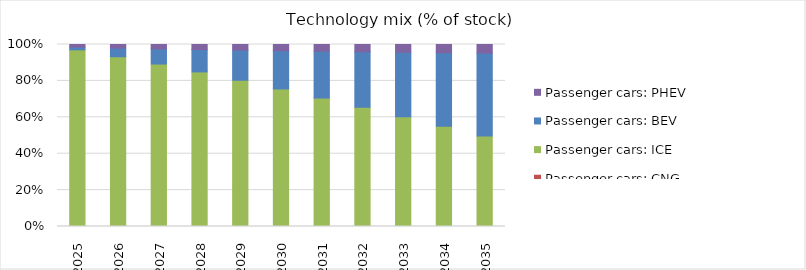
| Category | Passenger cars: CNG | Passenger cars: ICE | Passenger cars: BEV | Passenger cars: PHEV |
|---|---|---|---|---|
| 2025.0 | 0 | 0.97 | 0.015 | 0.014 |
| 2026.0 | 0 | 0.932 | 0.047 | 0.02 |
| 2027.0 | 0 | 0.892 | 0.083 | 0.024 |
| 2028.0 | 0 | 0.849 | 0.123 | 0.028 |
| 2029.0 | 0 | 0.803 | 0.165 | 0.031 |
| 2030.0 | 0 | 0.755 | 0.21 | 0.034 |
| 2031.0 | 0 | 0.706 | 0.257 | 0.037 |
| 2032.0 | 0 | 0.655 | 0.305 | 0.04 |
| 2033.0 | 0 | 0.603 | 0.354 | 0.042 |
| 2034.0 | 0 | 0.551 | 0.404 | 0.045 |
| 2035.0 | 0 | 0.498 | 0.455 | 0.047 |